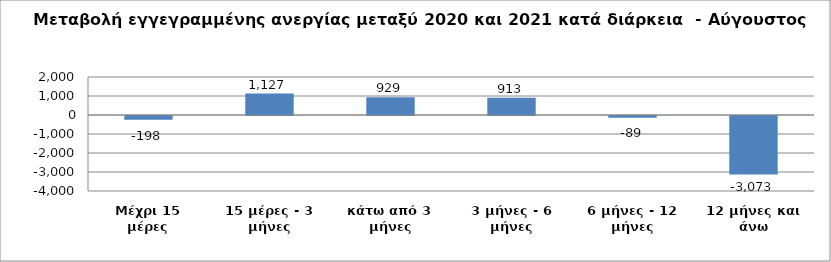
| Category | Series 0 |
|---|---|
| Μέχρι 15 μέρες | -198 |
| 15 μέρες - 3 μήνες | 1127 |
| κάτω από 3 μήνες | 929 |
| 3 μήνες - 6 μήνες | 913 |
| 6 μήνες - 12 μήνες | -89 |
| 12 μήνες και άνω | -3073 |